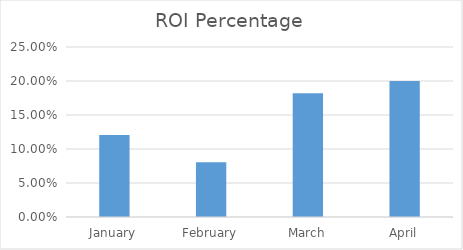
| Category | Series 0 |
|---|---|
| January | 0.121 |
| February | 0.081 |
| March | 0.182 |
| April | 0.2 |